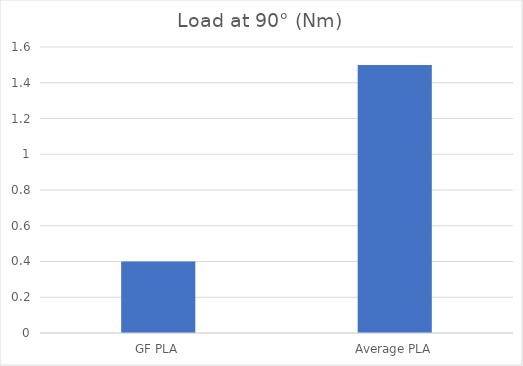
| Category | Load at 90° |
|---|---|
| GF PLA | 0.4 |
| Average PLA | 1.5 |